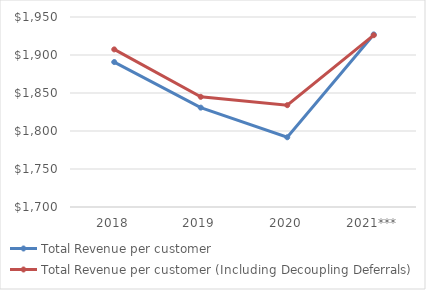
| Category | Total Revenue per customer  | Total Revenue per customer (Including Decoupling Deferrals) |
|---|---|---|
| 2018 | 1890.724 | 1907.369 |
| 2019 | 1830.747 | 1844.958 |
| 2020 | 1791.765 | 1833.984 |
| 2021*** | 1927.057 | 1926.045 |